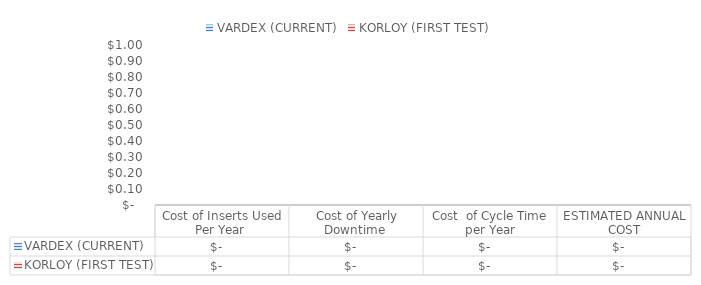
| Category | VARDEX (CURRENT) | KORLOY (FIRST TEST) |
|---|---|---|
| Cost of Inserts Used Per Year  | 0 | 0 |
|  Cost of Yearly Downtime  | 0 | 0 |
| Cost  of Cycle Time per Year | 0 | 0 |
| ESTIMATED ANNUAL COST | 0 | 0 |